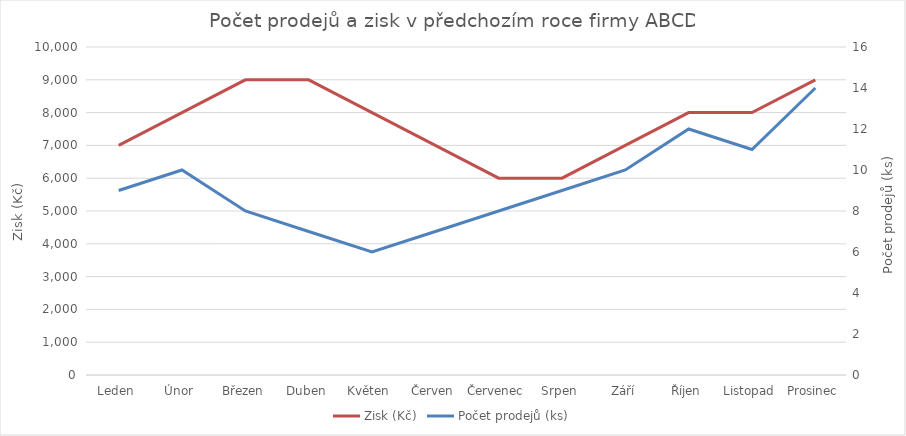
| Category | Zisk (Kč) |
|---|---|
| Leden | 7000 |
| Únor | 8000 |
| Březen | 9000 |
| Duben | 9000 |
| Květen | 8000 |
| Červen | 7000 |
| Červenec | 6000 |
| Srpen | 6000 |
| Září | 7000 |
| Říjen | 8000 |
| Listopad | 8000 |
| Prosinec | 9000 |